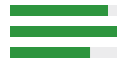
| Category | Series 0 | Series 1 |
|---|---|---|
| 0 | 0.917 | 0.083 |
| 1 | 1 | 0 |
| 2 | 0.75 | 0.25 |